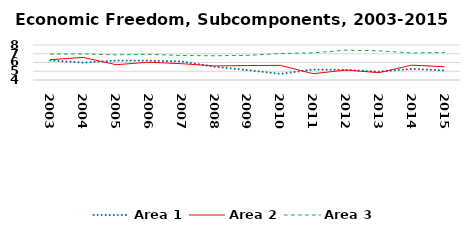
| Category | Area 1 | Area 2 | Area 3 |
|---|---|---|---|
| 2003.0 | 6.231 | 6.324 | 6.972 |
| 2004.0 | 5.989 | 6.579 | 6.978 |
| 2005.0 | 6.218 | 5.748 | 6.876 |
| 2006.0 | 6.213 | 6.034 | 6.933 |
| 2007.0 | 6.112 | 5.864 | 6.801 |
| 2008.0 | 5.518 | 5.608 | 6.768 |
| 2009.0 | 5.134 | 5.655 | 6.813 |
| 2010.0 | 4.701 | 5.675 | 7.027 |
| 2011.0 | 5.206 | 4.721 | 7.102 |
| 2012.0 | 5.161 | 5.138 | 7.414 |
| 2013.0 | 4.95 | 4.838 | 7.339 |
| 2014.0 | 5.276 | 5.698 | 7.086 |
| 2015.0 | 5.082 | 5.519 | 7.156 |